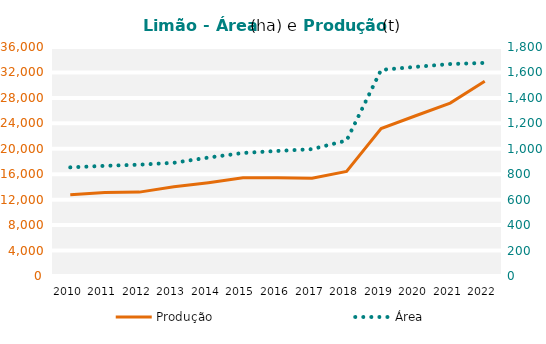
| Category | Produção  |
|---|---|
| 2010 | 12765 |
| 2011 | 13132 |
| 2012 | 13187 |
| 2013 | 14016 |
| 2014 | 14676 |
| 2015 | 15452 |
| 2016 | 15440 |
| 2017 | 15382 |
| 2018 | 16451 |
| 2019 | 23187 |
| 2020 | 25197 |
| 2021 | 27189 |
| 2022 | 30618 |